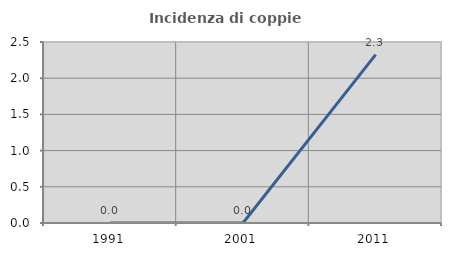
| Category | Incidenza di coppie miste |
|---|---|
| 1991.0 | 0 |
| 2001.0 | 0 |
| 2011.0 | 2.326 |